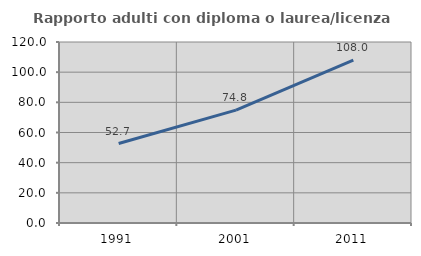
| Category | Rapporto adulti con diploma o laurea/licenza media  |
|---|---|
| 1991.0 | 52.688 |
| 2001.0 | 74.809 |
| 2011.0 | 108 |